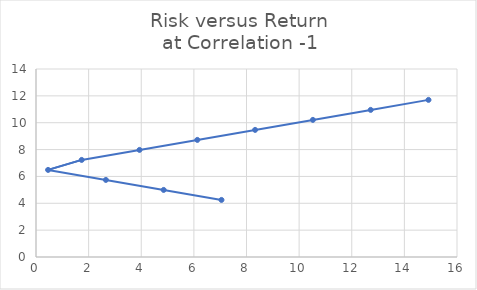
| Category | Return |
|---|---|
| 7.048936089935842 | 4.25 |
| 4.852365572225092 | 4.995 |
| 2.6557950545143414 | 5.74 |
| 0.4592245368035909 | 6.485 |
| 1.7373459809071594 | 7.23 |
| 3.9339164986179083 | 7.975 |
| 6.130487016328658 | 8.72 |
| 8.327057534039406 | 9.465 |
| 10.523628051750157 | 10.21 |
| 12.720198569460905 | 10.955 |
| 14.916769087171657 | 11.7 |